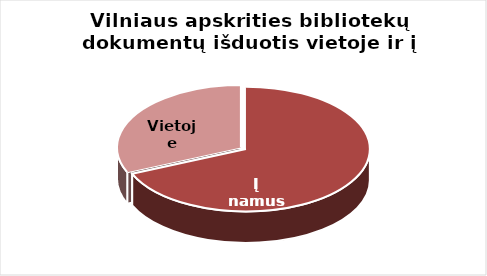
| Category | Series 0 |
|---|---|
| Į namus | 1602054 |
| Vietoje | 736600 |